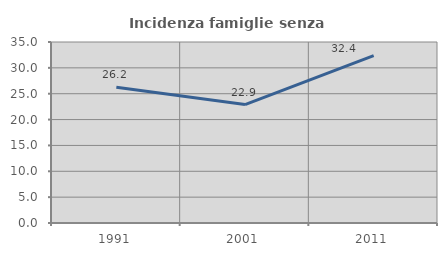
| Category | Incidenza famiglie senza nuclei |
|---|---|
| 1991.0 | 26.242 |
| 2001.0 | 22.893 |
| 2011.0 | 32.381 |